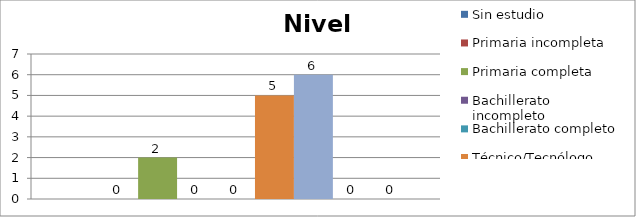
| Category | Sin estudio | Primaria incompleta | Primaria completa | Bachillerato incompleto | Bachillerato completo | Técnico/Tecnólogo | Universitario | Post-grado | Especialización |
|---|---|---|---|---|---|---|---|---|---|
| 0 |  | 0 | 2 | 0 | 0 | 5 | 6 | 0 | 0 |